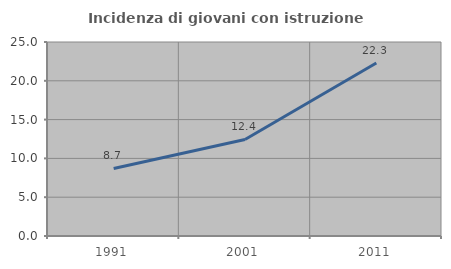
| Category | Incidenza di giovani con istruzione universitaria |
|---|---|
| 1991.0 | 8.707 |
| 2001.0 | 12.437 |
| 2011.0 | 22.293 |